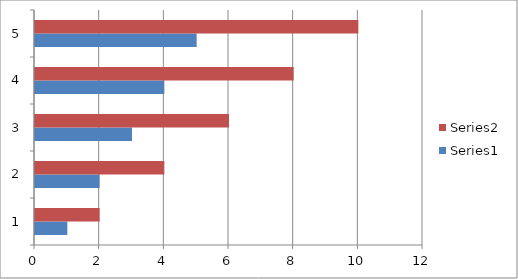
| Category | Series 0 | Series 1 |
|---|---|---|
| 0 | 1 | 2 |
| 1 | 2 | 4 |
| 2 | 3 | 6 |
| 3 | 4 | 8 |
| 4 | 5 | 10 |